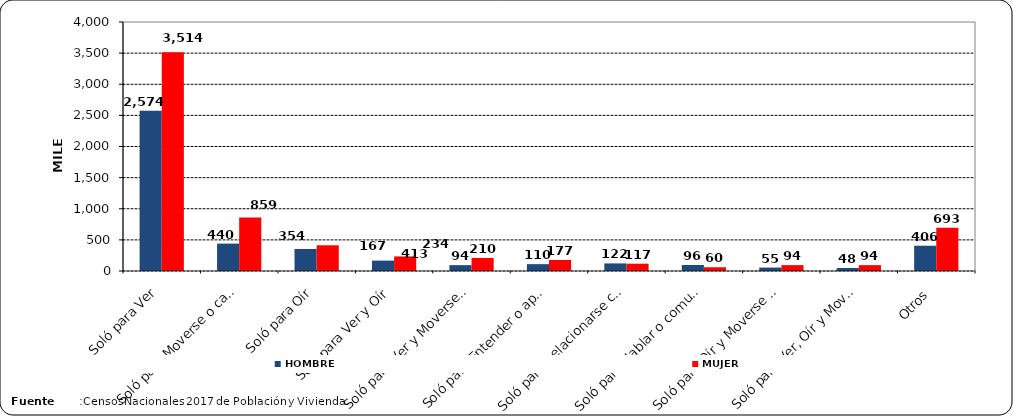
| Category | HOMBRE | MUJER |
|---|---|---|
|  Soló para Ver | 2574 | 3514 |
|  Soló para Moverse o caminar | 440 | 859 |
|  Soló para Oír | 354 | 413 |
|  Soló para Ver y Oír | 167 | 234 |
|  Soló para Ver y Moverse o caminar | 94 | 210 |
|  Soló para Entender o aprender | 110 | 177 |
|  Soló para Relacionarse con los demás | 122 | 117 |
|  Soló para Hablar o comunicarse | 96 | 60 |
|  Soló para Oír y Moverse o caminar | 55 | 94 |
|  Soló para Ver, Oír y Moverse o caminar | 48 | 94 |
|   Otros  | 406 | 693 |